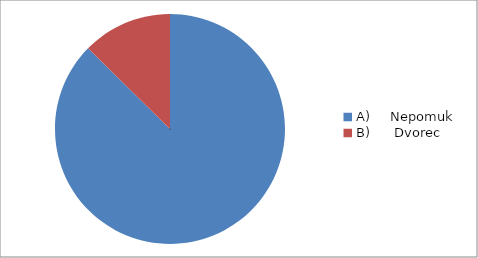
| Category | Series 0 |
|---|---|
| A)     Nepomuk    | 83 |
| B)      Dvorec | 12 |